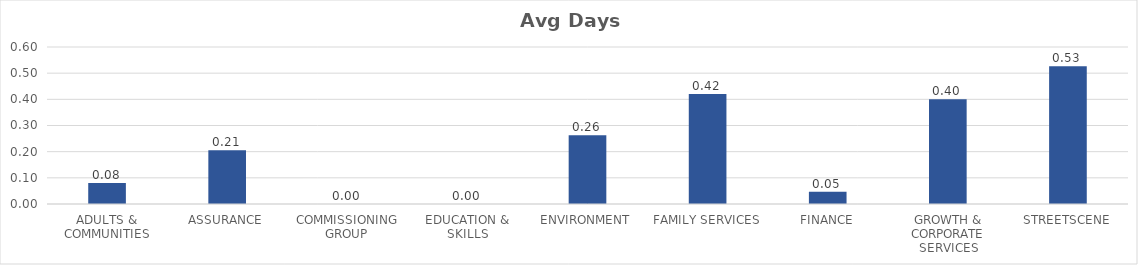
| Category | Avg Days Lost/FTE |
|---|---|
| ADULTS & COMMUNITIES | 0.08 |
| ASSURANCE | 0.205 |
| COMMISSIONING GROUP | 0 |
| EDUCATION & SKILLS | 0 |
| ENVIRONMENT | 0.263 |
| FAMILY SERVICES | 0.421 |
| FINANCE | 0.047 |
| GROWTH & CORPORATE SERVICES | 0.401 |
| STREETSCENE | 0.526 |